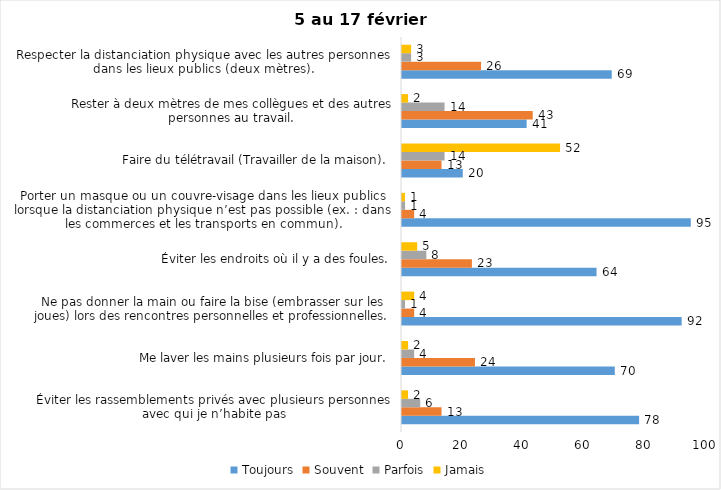
| Category | Toujours | Souvent | Parfois | Jamais |
|---|---|---|---|---|
| Éviter les rassemblements privés avec plusieurs personnes avec qui je n’habite pas | 78 | 13 | 6 | 2 |
| Me laver les mains plusieurs fois par jour. | 70 | 24 | 4 | 2 |
| Ne pas donner la main ou faire la bise (embrasser sur les joues) lors des rencontres personnelles et professionnelles. | 92 | 4 | 1 | 4 |
| Éviter les endroits où il y a des foules. | 64 | 23 | 8 | 5 |
| Porter un masque ou un couvre-visage dans les lieux publics lorsque la distanciation physique n’est pas possible (ex. : dans les commerces et les transports en commun). | 95 | 4 | 1 | 1 |
| Faire du télétravail (Travailler de la maison). | 20 | 13 | 14 | 52 |
| Rester à deux mètres de mes collègues et des autres personnes au travail. | 41 | 43 | 14 | 2 |
| Respecter la distanciation physique avec les autres personnes dans les lieux publics (deux mètres). | 69 | 26 | 3 | 3 |